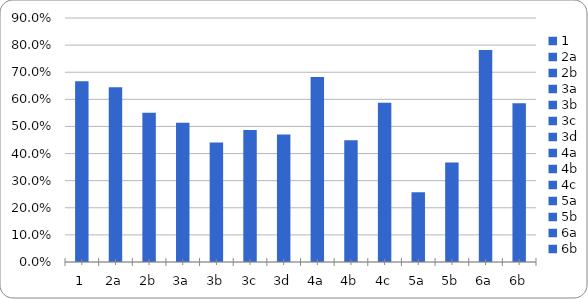
| Category | Series 0 |
|---|---|
| 1 | 0.667 |
| 2a | 0.644 |
| 2b | 0.551 |
| 3a | 0.514 |
| 3b | 0.441 |
| 3c | 0.486 |
| 3d | 0.47 |
| 4a | 0.682 |
| 4b | 0.449 |
| 4c | 0.588 |
| 5a | 0.257 |
| 5b | 0.367 |
| 6a | 0.782 |
| 6b | 0.585 |